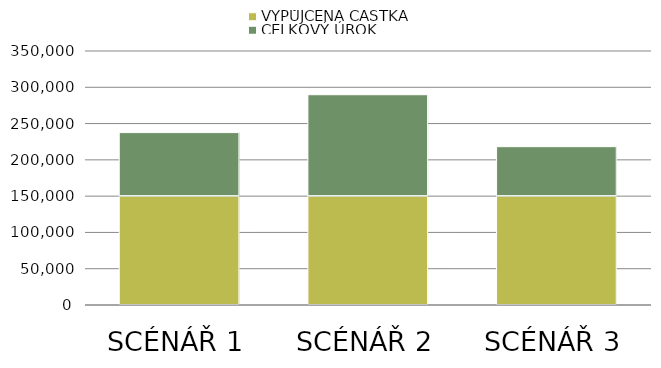
| Category | VYPŮJČENÁ ČÁSTKA | CELKOVÝ ÚROK |
|---|---|---|
| SCÉNÁŘ 1 | 150000 | 87584.066 |
| SCÉNÁŘ 2 | 150000 | 139753.762 |
| SCÉNÁŘ 3 | 150000 | 68152.919 |